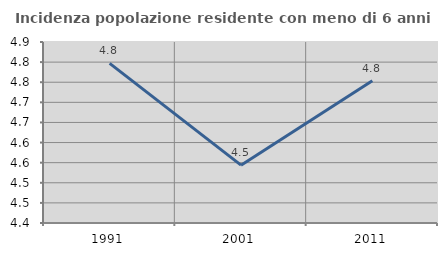
| Category | Incidenza popolazione residente con meno di 6 anni |
|---|---|
| 1991.0 | 4.797 |
| 2001.0 | 4.544 |
| 2011.0 | 4.754 |